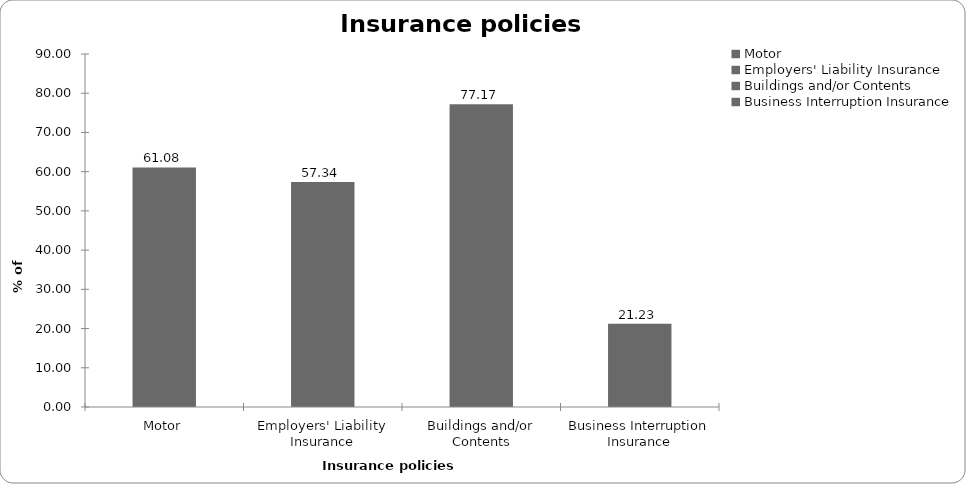
| Category | Series 0 |
|---|---|
| Motor | 61.081 |
| Employers' Liability Insurance | 57.343 |
| Buildings and/or Contents | 77.17 |
| Business Interruption Insurance | 21.228 |